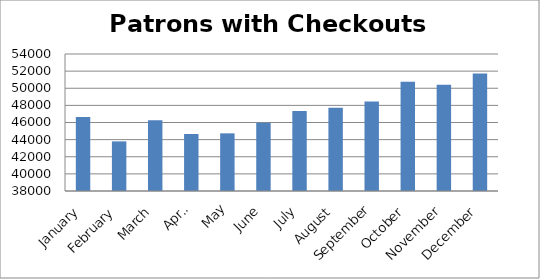
| Category | 46637 |
|---|---|
| January | 46637 |
| February | 43793 |
| March | 46254 |
| April | 44659 |
| May | 44734 |
| June | 45976 |
| July | 47349 |
| August | 47711 |
| September | 48446 |
| October | 50750 |
| November | 50396 |
| December | 51734 |